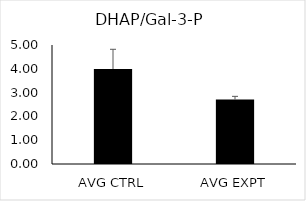
| Category | Series 0 |
|---|---|
| AVG CTRL | 3.992 |
| AVG EXPT | 2.705 |